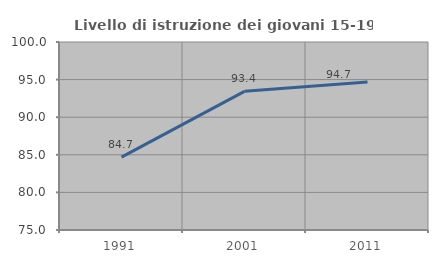
| Category | Livello di istruzione dei giovani 15-19 anni |
|---|---|
| 1991.0 | 84.687 |
| 2001.0 | 93.438 |
| 2011.0 | 94.694 |